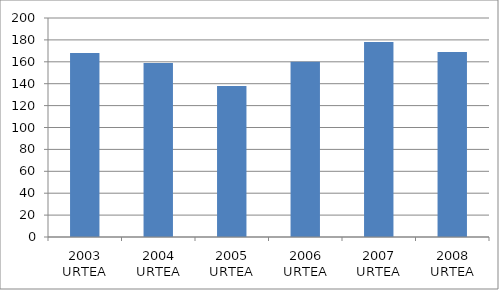
| Category | Series 0 |
|---|---|
| 2003 URTEA | 168 |
| 2004 URTEA | 159 |
| 2005 URTEA | 138 |
| 2006 URTEA | 160 |
| 2007 URTEA | 178 |
| 2008 URTEA | 169 |